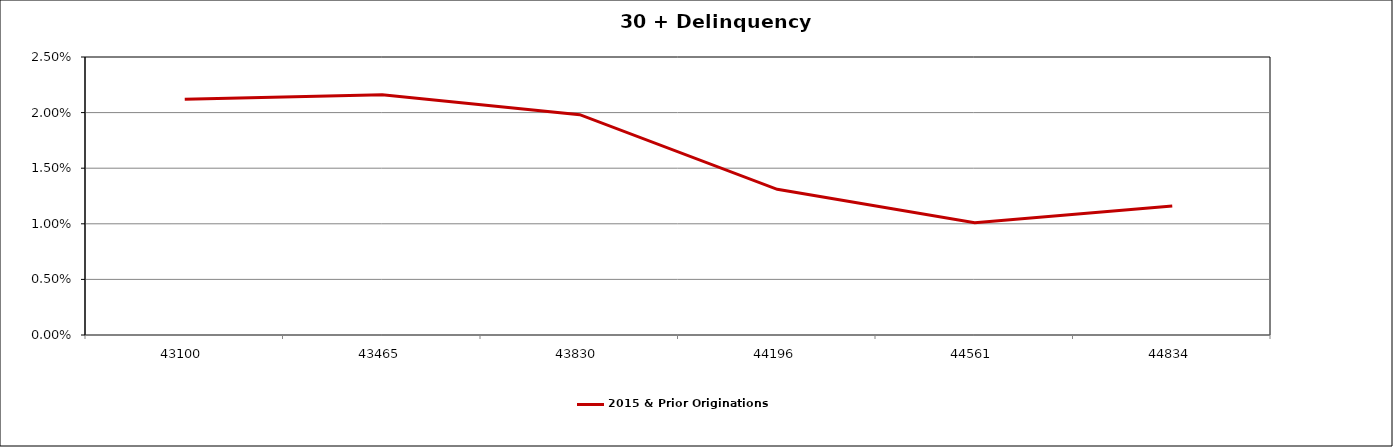
| Category | 2015 & Prior Originations |
|---|---|
| 2017-12-31 | 0.021 |
| 2018-12-31 | 0.022 |
| 2019-12-31 | 0.02 |
| 2020-12-31 | 0.013 |
| 2021-12-31 | 0.01 |
| 2022-09-30 | 0.012 |